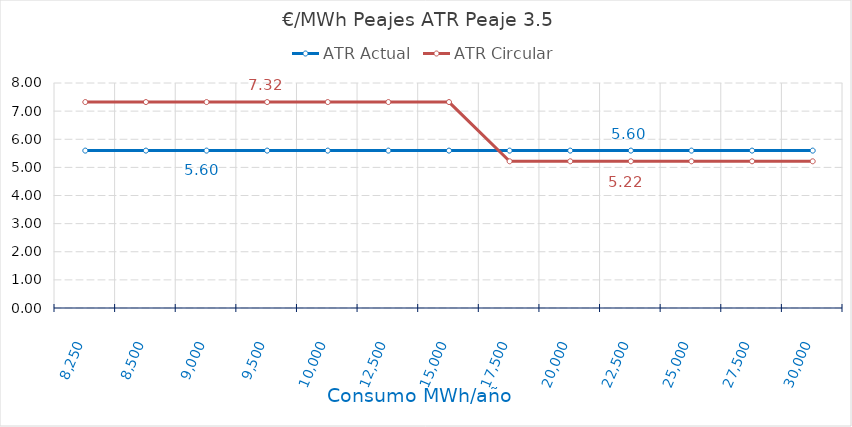
| Category | ATR Actual | ATR Circular |
|---|---|---|
| 8250.0 | 5.596 | 7.322 |
| 8500.0 | 5.596 | 7.322 |
| 9000.0 | 5.596 | 7.322 |
| 9500.0 | 5.596 | 7.322 |
| 10000.0 | 5.596 | 7.322 |
| 12500.0 | 5.596 | 7.322 |
| 15000.0 | 5.596 | 7.322 |
| 17500.0 | 5.596 | 5.216 |
| 20000.0 | 5.596 | 5.216 |
| 22500.0 | 5.596 | 5.216 |
| 25000.0 | 5.596 | 5.216 |
| 27500.0 | 5.596 | 5.216 |
| 30000.0 | 5.596 | 5.216 |